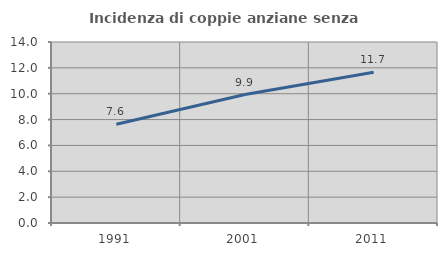
| Category | Incidenza di coppie anziane senza figli  |
|---|---|
| 1991.0 | 7.636 |
| 2001.0 | 9.935 |
| 2011.0 | 11.665 |